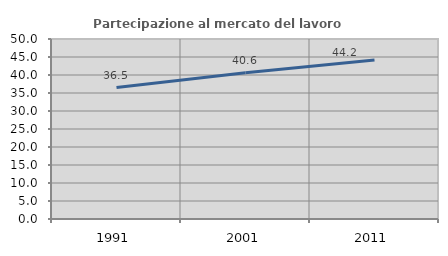
| Category | Partecipazione al mercato del lavoro  femminile |
|---|---|
| 1991.0 | 36.498 |
| 2001.0 | 40.65 |
| 2011.0 | 44.188 |